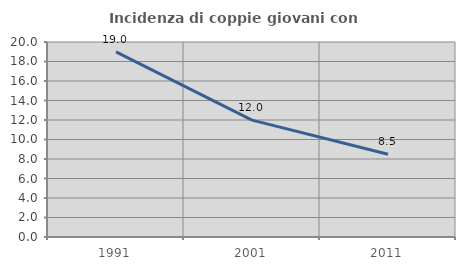
| Category | Incidenza di coppie giovani con figli |
|---|---|
| 1991.0 | 18.994 |
| 2001.0 | 11.99 |
| 2011.0 | 8.485 |